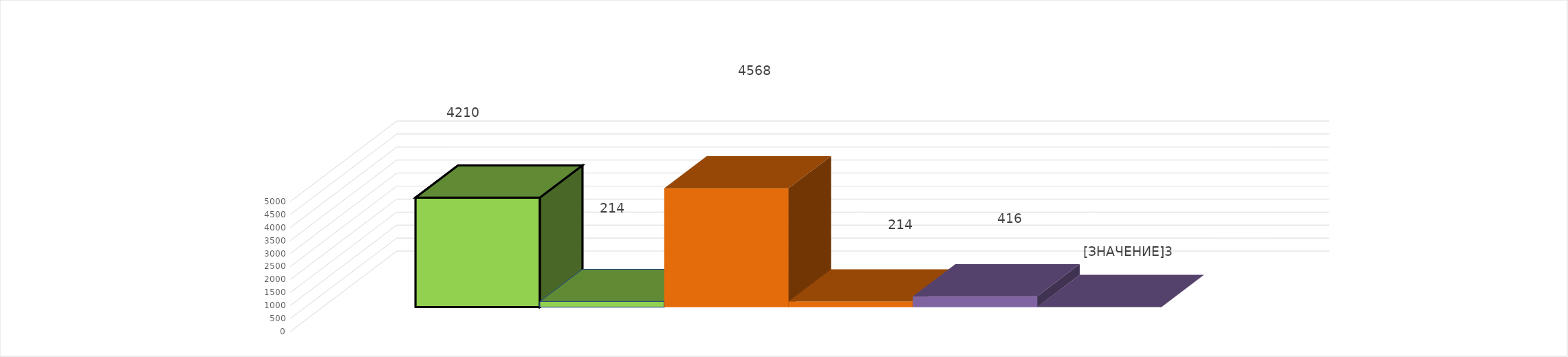
| Category | 3 квартал 2019 год | 3 квартал 2020 год |
|---|---|---|
| 0 | 416 | 1 |